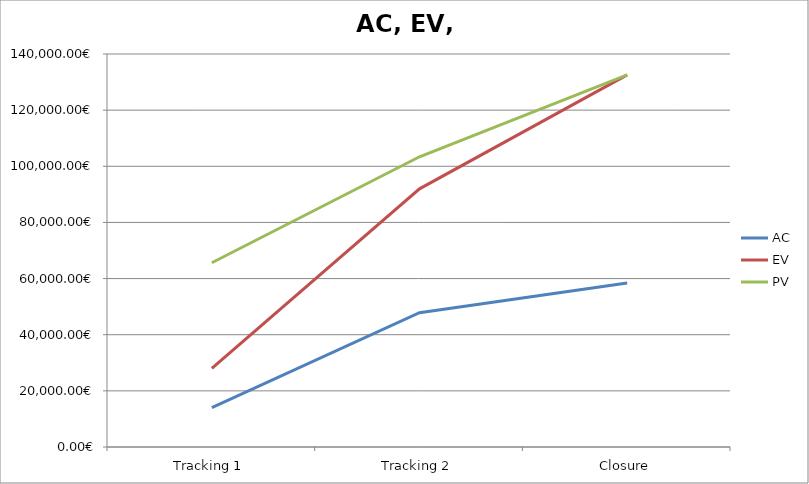
| Category | AC | EV | PV |
|---|---|---|---|
| Tracking 1 | 13995 | 28045.8 | 65625 |
| Tracking 2 | 47835 | 91958.7 | 103395 |
| Closure | 58410 | 132570 | 132570 |